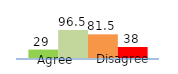
| Category | Series 0 | Series 1 | Series 2 | Series 3 |
|---|---|---|---|---|
| 0 | 29 | 96.5 | 81.5 | 38 |